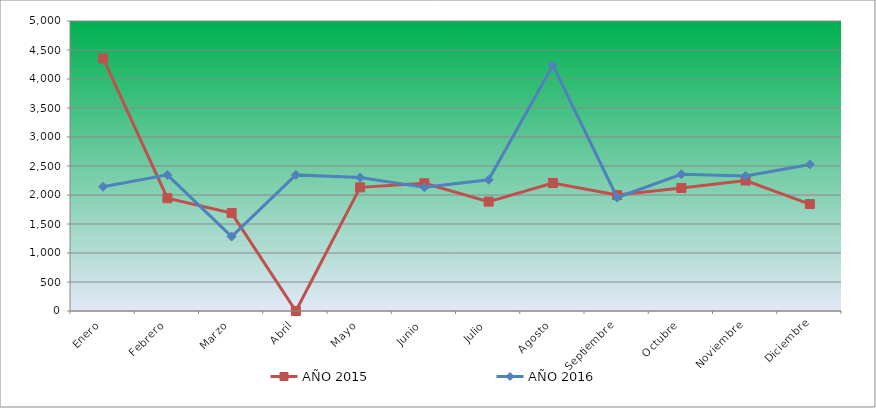
| Category | AÑO 2015 | AÑO 2016 |
|---|---|---|
| Enero | 4355.051 | 2143.065 |
| Febrero | 1945.078 | 2346.628 |
| Marzo | 1688.584 | 1283.577 |
| Abril | 0 | 2346.628 |
| Mayo | 2132.105 | 2301.392 |
| Junio | 2201.572 | 2131.756 |
| Julio | 1886.298 | 2261.81 |
| Agosto | 2206.915 | 4235.24 |
| Septiembre | 1998.514 | 1956.466 |
| Octubre | 2121.418 | 2357.937 |
| Noviembre | 2249.664 | 2329.665 |
| Diciembre | 1843.549 | 2527.573 |